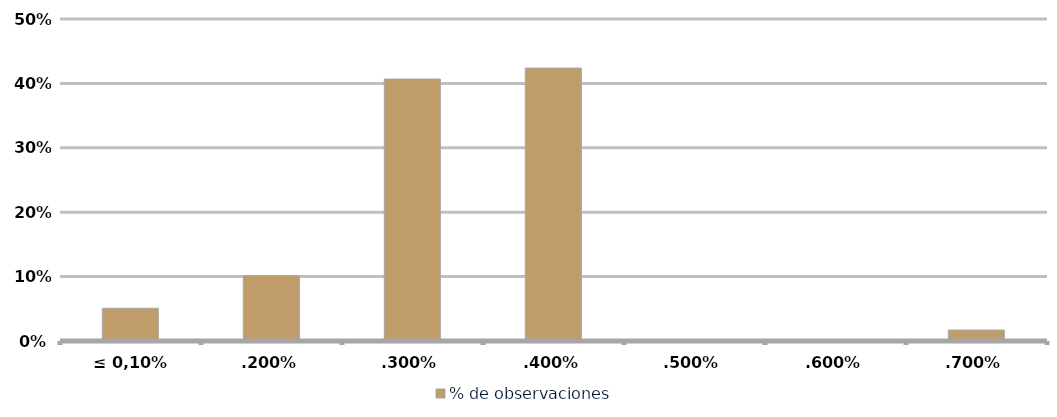
| Category | % de observaciones  |
|---|---|
| ≤ 0,10% | 0.051 |
| 0,20% | 0.102 |
| 0,30% | 0.407 |
| 0,40% | 0.424 |
| 0,50% | 0 |
| 0,60% | 0 |
| 0,70% | 0.017 |